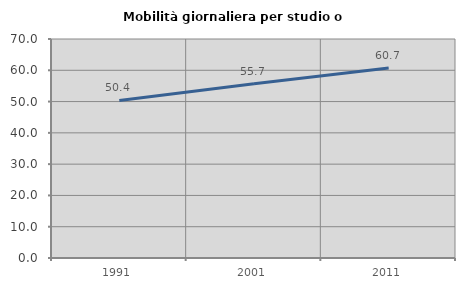
| Category | Mobilità giornaliera per studio o lavoro |
|---|---|
| 1991.0 | 50.35 |
| 2001.0 | 55.713 |
| 2011.0 | 60.731 |